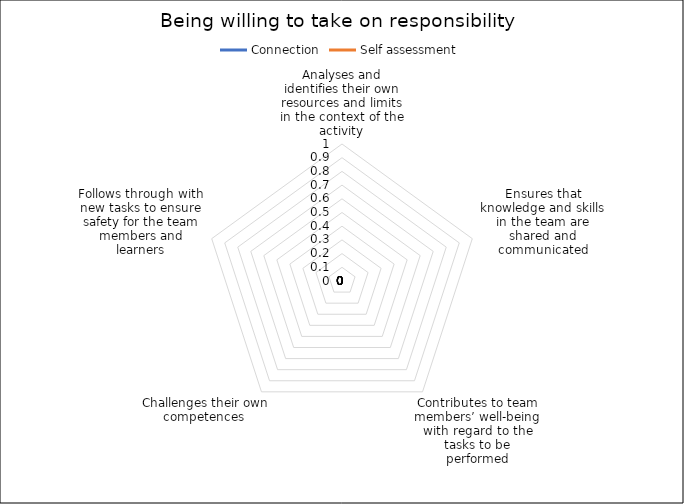
| Category | Connection | Self assessment |
|---|---|---|
| Analyses and identifies their own resources and limits in the context of the activity | 0 | 0 |
| Ensures that knowledge and skills in the team are shared and communicated | 0 | 0 |
| Contributes to team members’ well-being with regard to the tasks to be performed | 0 | 0 |
| Challenges their own competences  | 0 | 0 |
| Follows through with new tasks to ensure safety for the team members and learners | 0 | 0 |